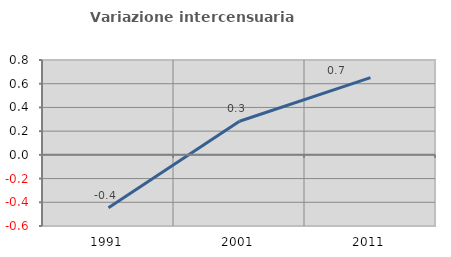
| Category | Variazione intercensuaria annua |
|---|---|
| 1991.0 | -0.446 |
| 2001.0 | 0.283 |
| 2011.0 | 0.651 |